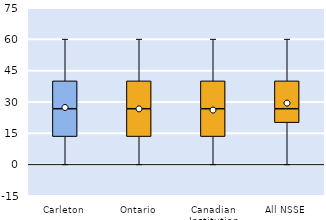
| Category | 25th | 50th | 75th |
|---|---|---|---|
| Carleton | 13.333 | 13.333 | 13.333 |
| Ontario | 13.333 | 13.333 | 13.333 |
| Canadian Institution | 13.333 | 13.333 | 13.333 |
| All NSSE | 20 | 6.667 | 13.333 |